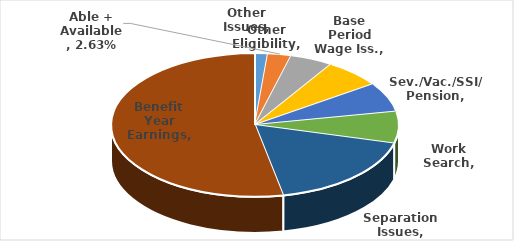
| Category | Series 0 |
|---|---|
| Other Eligibility | 0.014 |
| Able + Available | 0.026 |
| Base Period Wage Iss. | 0.048 |
| Other Issues | 0.065 |
| Sev./Vac./SSI/ Pension | 0.067 |
| Work Search | 0.071 |
| Separation Issues | 0.177 |
| Benefit Year Earnings | 0.531 |